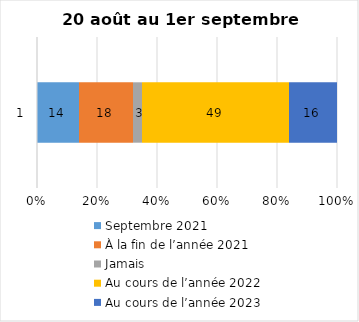
| Category | Septembre 2021 | À la fin de l’année 2021 | Jamais | Au cours de l’année 2022 | Au cours de l’année 2023 |
|---|---|---|---|---|---|
| 0 | 14 | 18 | 3 | 49 | 16 |